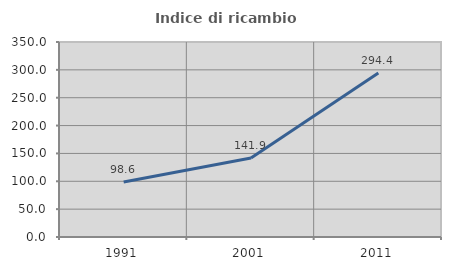
| Category | Indice di ricambio occupazionale  |
|---|---|
| 1991.0 | 98.605 |
| 2001.0 | 141.884 |
| 2011.0 | 294.403 |